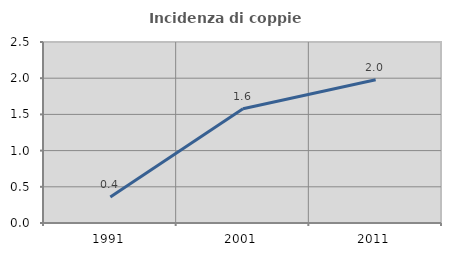
| Category | Incidenza di coppie miste |
|---|---|
| 1991.0 | 0.359 |
| 2001.0 | 1.578 |
| 2011.0 | 1.979 |